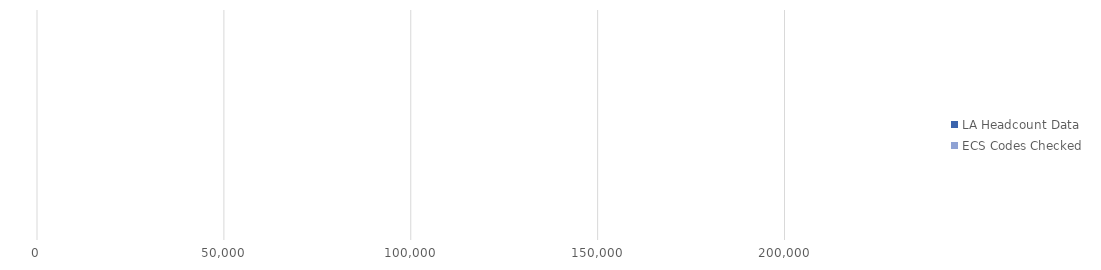
| Category | LA Headcount Data | ECS Codes Checked |
|---|---|---|
| 0 | 0 | 0 |